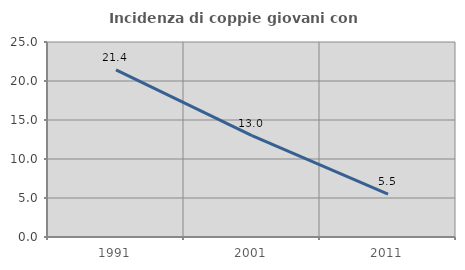
| Category | Incidenza di coppie giovani con figli |
|---|---|
| 1991.0 | 21.429 |
| 2001.0 | 12.987 |
| 2011.0 | 5.505 |